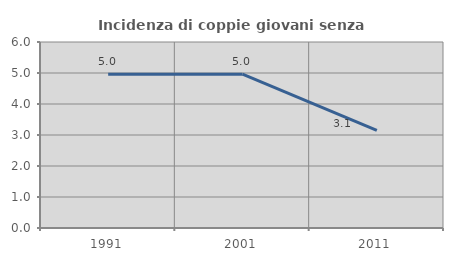
| Category | Incidenza di coppie giovani senza figli |
|---|---|
| 1991.0 | 4.959 |
| 2001.0 | 4.96 |
| 2011.0 | 3.147 |